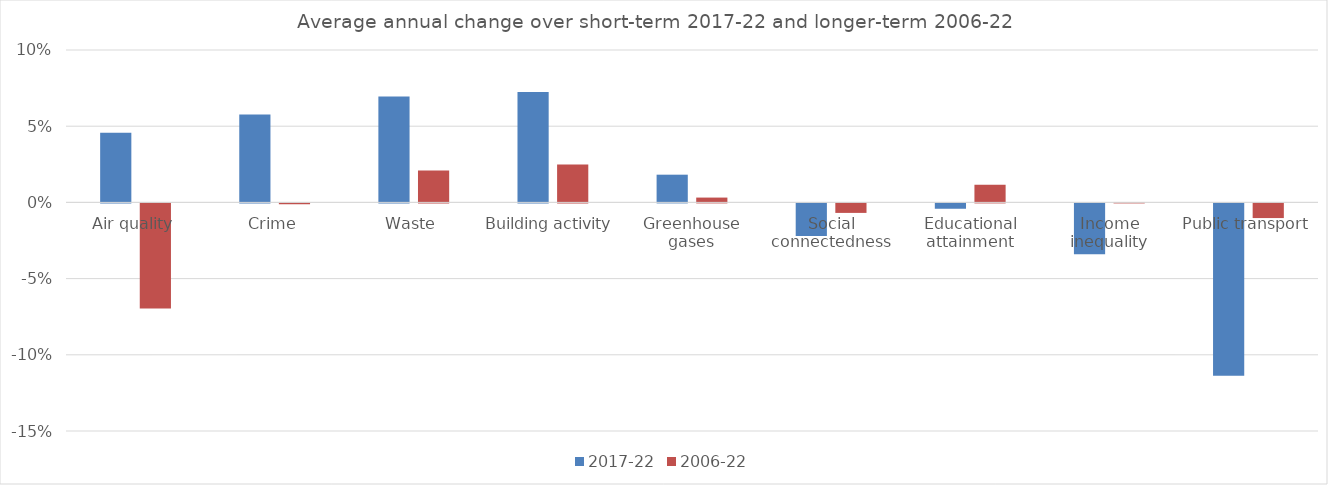
| Category | 2017-22 | 2006-22 |
|---|---|---|
| Air quality | 0.046 | -0.069 |
| Crime | 0.058 | -0.001 |
| Waste | 0.07 | 0.021 |
| Building activity | 0.072 | 0.025 |
| Greenhouse gases | 0.018 | 0.003 |
| Social connectedness | -0.021 | -0.006 |
| Educational attainment | -0.004 | 0.012 |
| Income inequality | -0.033 | 0 |
| Public transport | -0.113 | -0.01 |